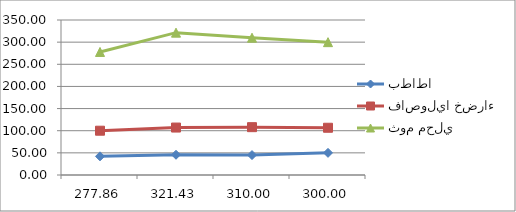
| Category | بطاطا | فاصوليا خضراء | ثوم محلي |
|---|---|---|---|
| 277.85714285714283 | 42.143 | 100 | 277.857 |
| 321.42857142857144 | 45.714 | 107.143 | 321.429 |
| 310.0 | 45 | 108 | 310 |
| 300.0 | 50 | 106.667 | 300 |